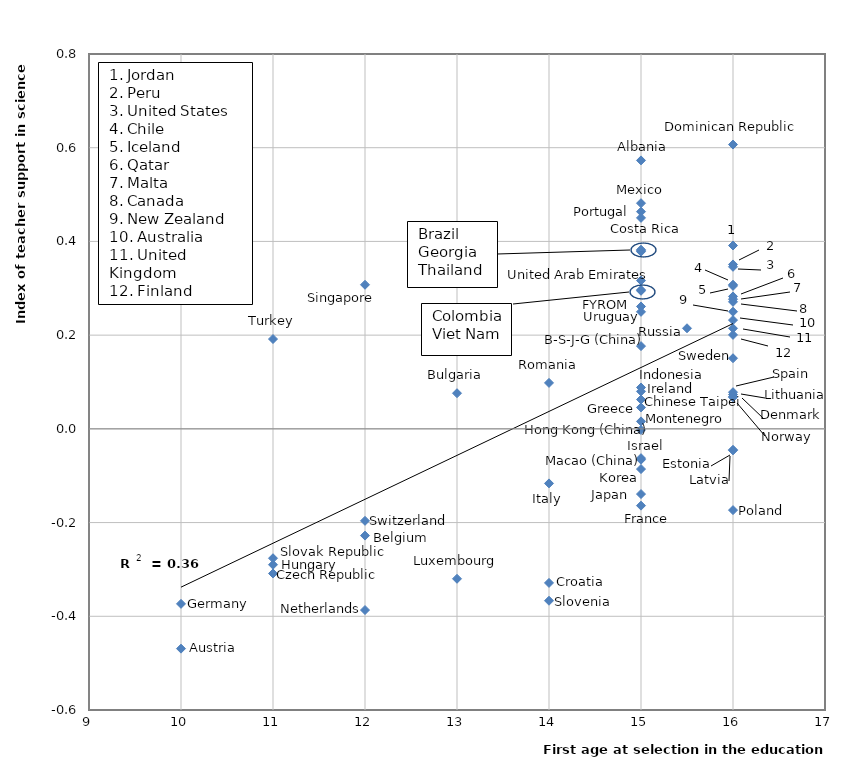
| Category | First age of selection in the education system |
|---|---|
| 16.0 | 0.232 |
| 10.0 | -0.469 |
| 12.0 | -0.228 |
| 16.0 | 0.271 |
| 16.0 | 0.308 |
| 11.0 | -0.309 |
| 16.0 | 0.069 |
| 16.0 | -0.046 |
| 16.0 | 0.201 |
| 15.0 | -0.164 |
| 10.0 | -0.373 |
| 15.0 | 0.046 |
| 11.0 | -0.29 |
| 16.0 | 0.305 |
| 15.0 | 0.08 |
| 15.0 | -0.063 |
| 14.0 | -0.116 |
| 15.0 | -0.139 |
| 15.0 | -0.086 |
| 16.0 | -0.045 |
| 13.0 | -0.32 |
| 15.0 | 0.482 |
| 12.0 | -0.387 |
| 16.0 | 0.25 |
| 16.0 | 0.067 |
| 16.0 | -0.173 |
| 15.0 | 0.463 |
| 11.0 | -0.276 |
| 14.0 | -0.367 |
| 16.0 | 0.078 |
| 16.0 | 0.151 |
| 12.0 | -0.196 |
| 11.0 | 0.192 |
| 16.0 | 0.215 |
| 16.0 | 0.346 |
| 15.0 | 0.573 |
| 15.0 | 0.38 |
| 15.0 | 0.177 |
| 13.0 | 0.076 |
| 15.0 | 0.295 |
| 15.0 | 0.45 |
| 14.0 | -0.329 |
| 16.0 | 0.607 |
| 15.0 | 0.261 |
| 15.0 | 0.378 |
| 15.0 | -0.002 |
| 15.0 | 0.088 |
| 16.0 | 0.391 |
| 16.0 | 0.073 |
| 15.0 | -0.066 |
| 16.0 | 0.277 |
| 15.0 | 0.016 |
| 16.0 | 0.351 |
| 16.0 | 0.283 |
| 14.0 | 0.098 |
| 15.5 | 0.215 |
| 12.0 | 0.308 |
| 15.0 | 0.063 |
| 15.0 | 0.382 |
| 15.0 | 0.316 |
| 15.0 | 0.25 |
| 15.0 | 0.297 |
| 15.0 | 0.037 |